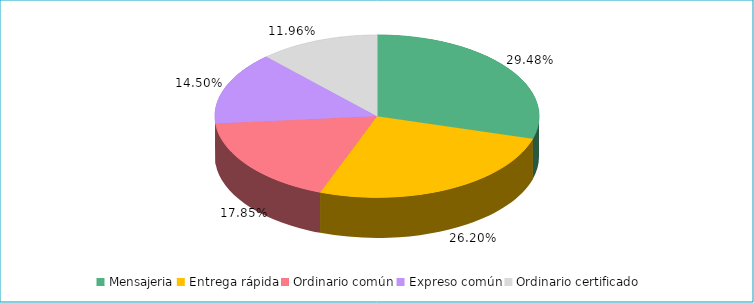
| Category | Series 0 |
|---|---|
| Mensajeria | 0.295 |
| Entrega rápida | 0.262 |
| Ordinario común | 0.178 |
| Expreso común | 0.145 |
| Ordinario certificado | 0.12 |